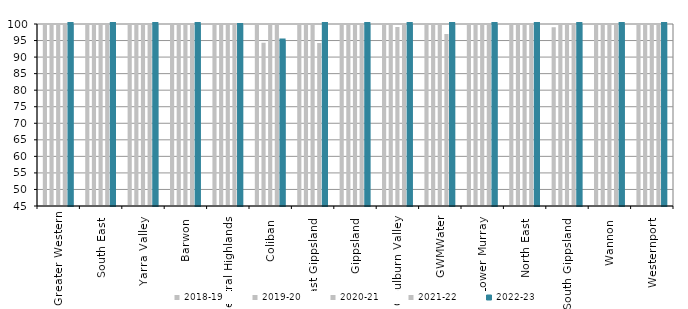
| Category | 2018-19 | 2019-20 | 2020-21 | 2021-22 | 2022-23 |
|---|---|---|---|---|---|
| Greater Western | 99.955 | 100 | 100 | 100 | 100 |
| South East  | 100 | 100 | 99.99 | 100 | 99.97 |
| Yarra Valley  | 100 | 100 | 100 | 100 | 100 |
| Barwon  | 100 | 100 | 100 | 100 | 100 |
| Central Highlands  | 100 | 100 | 99.8 | 100 | 99.7 |
| Coliban  | 100 | 94.3 | 100 | 100 | 95 |
| East Gippsland  | 100 | 100 | 100 | 94.26 | 100 |
| Gippsland  | 100 | 100 | 99.7 | 100 | 100 |
| Goulburn Valley  | 100 | 100 | 99.11 | 100 | 100 |
| GWMWater | 100 | 100 | 100 | 97 | 100 |
| Lower Murray  | 100 | 100 | 100 | 100 | 100 |
| North East  | 100 | 100 | 100 | 100 | 100 |
| South Gippsland  | 99.04 | 100 | 100 | 100 | 100 |
| Wannon  | 100 | 100 | 100 | 100 | 100 |
| Westernport  | 100 | 100 | 100 | 100 | 100 |